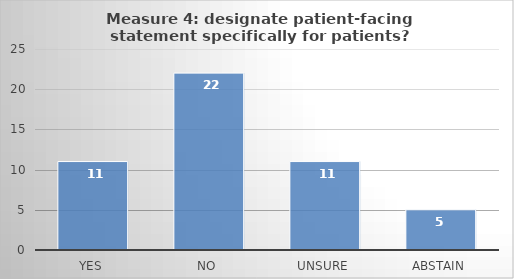
| Category | Series 0 |
|---|---|
| Yes | 11 |
| No | 22 |
| Unsure | 11 |
| Abstain | 5 |